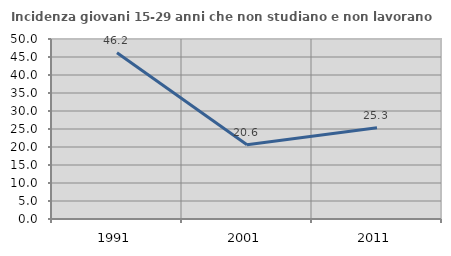
| Category | Incidenza giovani 15-29 anni che non studiano e non lavorano  |
|---|---|
| 1991.0 | 46.154 |
| 2001.0 | 20.606 |
| 2011.0 | 25.325 |